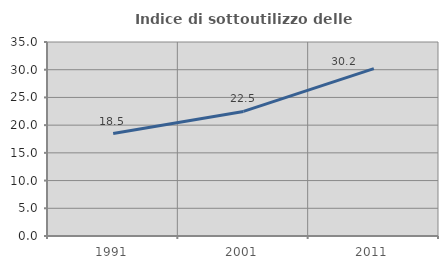
| Category | Indice di sottoutilizzo delle abitazioni  |
|---|---|
| 1991.0 | 18.475 |
| 2001.0 | 22.472 |
| 2011.0 | 30.207 |